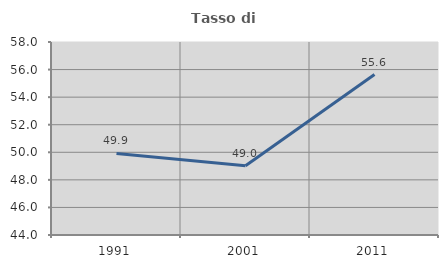
| Category | Tasso di occupazione   |
|---|---|
| 1991.0 | 49.916 |
| 2001.0 | 49.02 |
| 2011.0 | 55.638 |